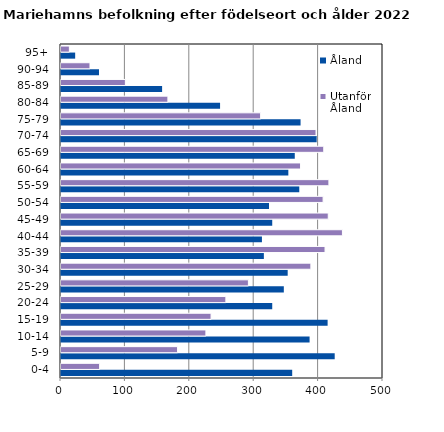
| Category | Åland | Utanför Åland |
|---|---|---|
| 0-4 | 359 | 60 |
| 5-9 | 425 | 181 |
| 10-14 | 386 | 225 |
| 15-19 | 414 | 233 |
| 20-24 | 328 | 256 |
| 25-29 | 346 | 291 |
| 30-34 | 352 | 388 |
| 35-39 | 315 | 410 |
| 40-44 | 312 | 437 |
| 45-49 | 328 | 415 |
| 50-54 | 323 | 407 |
| 55-59 | 370 | 416 |
| 60-64 | 353 | 372 |
| 65-69 | 363 | 408 |
| 70-74 | 397 | 396 |
| 75-79 | 372 | 310 |
| 80-84 | 247 | 166 |
| 85-89 | 157 | 100 |
| 90-94 | 59 | 45 |
| 95+ | 22 | 13 |